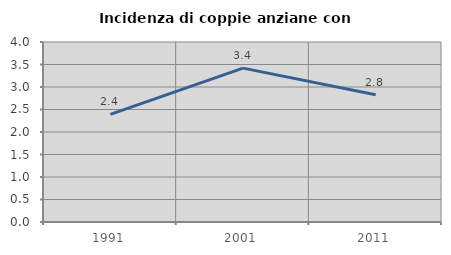
| Category | Incidenza di coppie anziane con figli |
|---|---|
| 1991.0 | 2.392 |
| 2001.0 | 3.419 |
| 2011.0 | 2.827 |